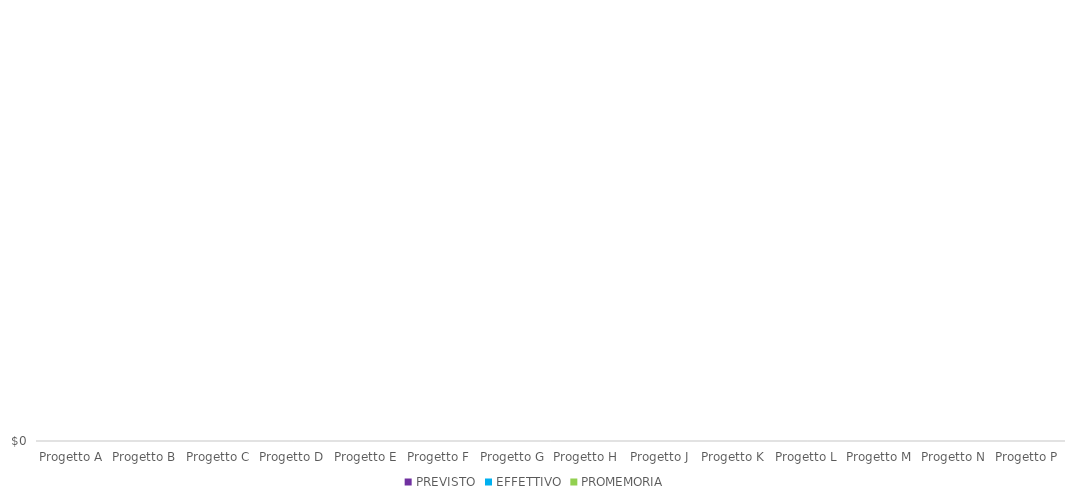
| Category | PREVISTO | EFFETTIVO | PROMEMORIA |
|---|---|---|---|
| Progetto A |  |  | 0 |
| Progetto B |  |  | 0 |
| Progetto C |  |  | 0 |
| Progetto D |  |  | 0 |
| Progetto E |  |  | 0 |
| Progetto F |  |  | 0 |
| Progetto G |  |  | 0 |
| Progetto H |  |  | 0 |
| Progetto J |  |  | 0 |
| Progetto K |  |  | 0 |
| Progetto L |  |  | 0 |
| Progetto M |  |  | 0 |
| Progetto N |  |  | 0 |
| Progetto P |  |  | 0 |